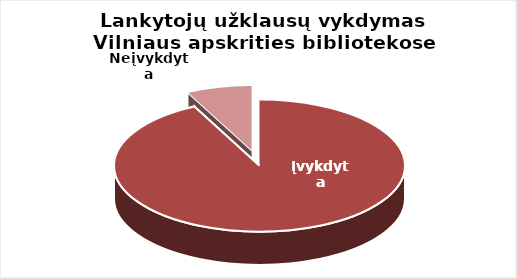
| Category | Series 0 |
|---|---|
| Įvykdyta | 389022 |
| Neįvykdyta | 31040 |